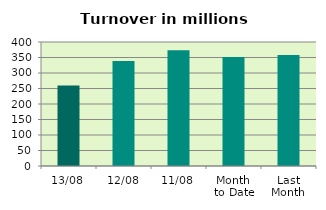
| Category | Series 0 |
|---|---|
| 13/08 | 259.751 |
| 12/08 | 338.458 |
| 11/08 | 373.162 |
| Month 
to Date | 351.314 |
| Last
Month | 357.784 |